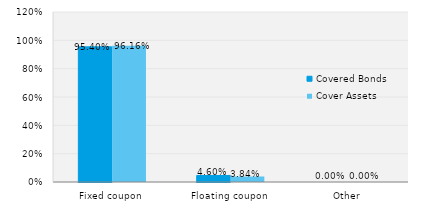
| Category | Covered Bonds | Cover Assets |
|---|---|---|
| Fixed coupon | 0.954 | 0.962 |
| Floating coupon | 0.046 | 0.038 |
| Other | 0 | 0 |